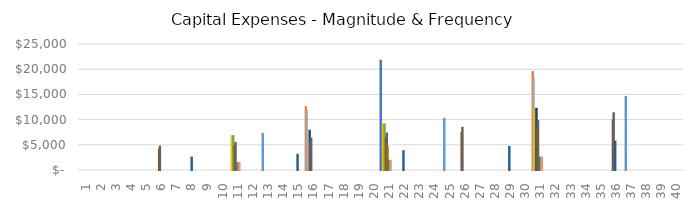
| Category | Roof | Remodel - Kitchen | Windows | Air Conditioning | Furnace/Heat Source | Paint - Exterior | Remodel - Bathrooms | Paint - Interior | Carpet/Flooring | Gutters | Landscaping | Fixtures - Electrical | Fixtures - Plumbing | Water Heater | Custom CapEx 1 | Custom CapEx 2 | Custom CapEx 3 | Custom CapEx 4 | Custom CapEx 5 |
|---|---|---|---|---|---|---|---|---|---|---|---|---|---|---|---|---|---|---|---|
| 1.0 | 0 | 0 | 0 | 0 | 0 | 0 | 0 | 0 | 0 | 0 | 0 | 0 | 0 | 0 | 0 | 0 | 0 | 0 | 0 |
| 2.0 | 0 | 0 | 0 | 0 | 0 | 0 | 0 | 0 | 0 | 0 | 0 | 0 | 0 | 0 | 0 | 0 | 0 | 0 | 0 |
| 3.0 | 0 | 0 | 0 | 0 | 0 | 0 | 0 | 0 | 0 | 0 | 0 | 0 | 0 | 0 | 0 | 0 | 0 | 0 | 0 |
| 4.0 | 0 | 0 | 0 | 0 | 0 | 0 | 0 | 0 | 0 | 0 | 0 | 0 | 0 | 0 | 0 | 0 | 0 | 0 | 0 |
| 5.0 | 0 | 0 | 0 | 0 | 0 | 0 | 0 | 0 | 0 | 0 | 0 | 0 | 0 | 0 | 0 | 0 | 0 | 0 | 0 |
| 6.0 | 0 | 0 | 0 | 0 | 0 | 0 | 0 | 4057.459 | 4637.096 | 0 | 0 | 0 | 0 | 0 | 0 | 0 | 0 | 0 | 0 |
| 7.0 | 0 | 0 | 0 | 0 | 0 | 0 | 0 | 0 | 0 | 0 | 0 | 0 | 0 | 0 | 0 | 0 | 0 | 0 | 0 |
| 8.0 | 0 | 0 | 0 | 0 | 0 | 0 | 0 | 0 | 0 | 0 | 2459.748 | 0 | 0 | 0 | 0 | 0 | 0 | 0 | 0 |
| 9.0 | 0 | 0 | 0 | 0 | 0 | 0 | 0 | 0 | 0 | 0 | 0 | 0 | 0 | 0 | 0 | 0 | 0 | 0 | 0 |
| 10.0 | 0 | 0 | 0 | 0 | 0 | 0 | 0 | 0 | 0 | 0 | 0 | 0 | 0 | 0 | 0 | 0 | 0 | 0 | 0 |
| 11.0 | 0 | 0 | 0 | 6719.582 | 0 | 6719.582 | 0 | 4703.707 | 5375.666 | 0 | 0 | 1343.916 | 1343.916 | 1343.916 | 0 | 0 | 0 | 0 | 0 |
| 12.0 | 0 | 0 | 0 | 0 | 0 | 0 | 0 | 0 | 0 | 0 | 0 | 0 | 0 | 0 | 0 | 0 | 0 | 0 | 0 |
| 13.0 | 0 | 0 | 0 | 0 | 7128.804 | 0 | 0 | 0 | 0 | 0 | 0 | 0 | 0 | 0 | 0 | 0 | 0 | 0 | 0 |
| 14.0 | 0 | 0 | 0 | 0 | 0 | 0 | 0 | 0 | 0 | 0 | 0 | 0 | 0 | 0 | 0 | 0 | 0 | 0 | 0 |
| 15.0 | 0 | 0 | 0 | 0 | 0 | 0 | 0 | 0 | 0 | 0 | 3025.179 | 0 | 0 | 0 | 0 | 0 | 0 | 0 | 0 |
| 16.0 | 0 | 12463.739 | 11684.756 | 0 | 0 | 0 | 7789.837 | 5452.886 | 6231.87 | 0 | 0 | 0 | 0 | 0 | 0 | 0 | 0 | 0 | 0 |
| 17.0 | 0 | 0 | 0 | 0 | 0 | 0 | 0 | 0 | 0 | 0 | 0 | 0 | 0 | 0 | 0 | 0 | 0 | 0 | 0 |
| 18.0 | 0 | 0 | 0 | 0 | 0 | 0 | 0 | 0 | 0 | 0 | 0 | 0 | 0 | 0 | 0 | 0 | 0 | 0 | 0 |
| 19.0 | 0 | 0 | 0 | 0 | 0 | 0 | 0 | 0 | 0 | 0 | 0 | 0 | 0 | 0 | 0 | 0 | 0 | 0 | 0 |
| 20.0 | 0 | 0 | 0 | 0 | 0 | 0 | 0 | 0 | 0 | 0 | 0 | 0 | 0 | 0 | 0 | 0 | 0 | 0 | 0 |
| 21.0 | 21673.335 | 0 | 0 | 9030.556 | 0 | 9030.556 | 0 | 6321.389 | 7224.445 | 4515.278 | 0 | 1806.111 | 1806.111 | 1806.111 | 0 | 0 | 0 | 0 | 0 |
| 22.0 | 0 | 0 | 0 | 0 | 0 | 0 | 0 | 0 | 0 | 0 | 3720.589 | 0 | 0 | 0 | 0 | 0 | 0 | 0 | 0 |
| 23.0 | 0 | 0 | 0 | 0 | 0 | 0 | 0 | 0 | 0 | 0 | 0 | 0 | 0 | 0 | 0 | 0 | 0 | 0 | 0 |
| 24.0 | 0 | 0 | 0 | 0 | 0 | 0 | 0 | 0 | 0 | 0 | 0 | 0 | 0 | 0 | 0 | 0 | 0 | 0 | 0 |
| 25.0 | 0 | 0 | 0 | 0 | 10163.971 | 0 | 0 | 0 | 0 | 0 | 0 | 0 | 0 | 0 | 0 | 0 | 0 | 0 | 0 |
| 26.0 | 0 | 0 | 0 | 0 | 0 | 0 | 0 | 7328.223 | 8375.112 | 0 | 0 | 0 | 0 | 0 | 0 | 0 | 0 | 0 | 0 |
| 27.0 | 0 | 0 | 0 | 0 | 0 | 0 | 0 | 0 | 0 | 0 | 0 | 0 | 0 | 0 | 0 | 0 | 0 | 0 | 0 |
| 28.0 | 0 | 0 | 0 | 0 | 0 | 0 | 0 | 0 | 0 | 0 | 0 | 0 | 0 | 0 | 0 | 0 | 0 | 0 | 0 |
| 29.0 | 0 | 0 | 0 | 0 | 0 | 0 | 0 | 0 | 0 | 0 | 4575.855 | 0 | 0 | 0 | 0 | 0 | 0 | 0 | 0 |
| 30.0 | 0 | 0 | 0 | 0 | 0 | 0 | 0 | 0 | 0 | 0 | 0 | 0 | 0 | 0 | 0 | 0 | 0 | 0 | 0 |
| 31.0 | 0 | 19418.1 | 18204.469 | 12136.312 | 0 | 12136.312 | 12136.312 | 8495.419 | 9709.05 | 0 | 0 | 2427.262 | 2427.262 | 2427.262 | 0 | 0 | 0 | 0 | 0 |
| 32.0 | 0 | 0 | 0 | 0 | 0 | 0 | 0 | 0 | 0 | 0 | 0 | 0 | 0 | 0 | 0 | 0 | 0 | 0 | 0 |
| 33.0 | 0 | 0 | 0 | 0 | 0 | 0 | 0 | 0 | 0 | 0 | 0 | 0 | 0 | 0 | 0 | 0 | 0 | 0 | 0 |
| 34.0 | 0 | 0 | 0 | 0 | 0 | 0 | 0 | 0 | 0 | 0 | 0 | 0 | 0 | 0 | 0 | 0 | 0 | 0 | 0 |
| 35.0 | 0 | 0 | 0 | 0 | 0 | 0 | 0 | 0 | 0 | 0 | 0 | 0 | 0 | 0 | 0 | 0 | 0 | 0 | 0 |
| 36.0 | 0 | 0 | 0 | 0 | 0 | 0 | 0 | 9848.519 | 11255.45 | 0 | 5627.725 | 0 | 0 | 0 | 0 | 0 | 0 | 0 | 0 |
| 37.0 | 0 | 0 | 0 | 0 | 14491.392 | 0 | 0 | 0 | 0 | 0 | 0 | 0 | 0 | 0 | 0 | 0 | 0 | 0 | 0 |
| 38.0 | 0 | 0 | 0 | 0 | 0 | 0 | 0 | 0 | 0 | 0 | 0 | 0 | 0 | 0 | 0 | 0 | 0 | 0 | 0 |
| 39.0 | 0 | 0 | 0 | 0 | 0 | 0 | 0 | 0 | 0 | 0 | 0 | 0 | 0 | 0 | 0 | 0 | 0 | 0 | 0 |
| 40.0 | 0 | 0 | 0 | 0 | 0 | 0 | 0 | 0 | 0 | 0 | 0 | 0 | 0 | 0 | 0 | 0 | 0 | 0 | 0 |